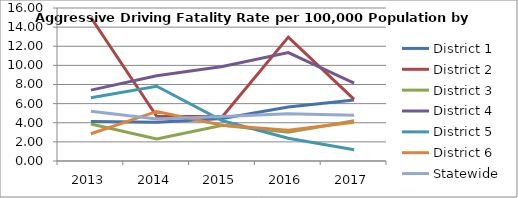
| Category | District 1 | District 2 | District 3 | District 4 | District 5 | District 6 | Statewide |
|---|---|---|---|---|---|---|---|
| 2013.0 | 4.137 | 15.011 | 3.876 | 7.413 | 6.621 | 2.85 | 5.21 |
| 2014.0 | 4.065 | 4.671 | 2.306 | 8.924 | 7.82 | 5.183 | 4.405 |
| 2015.0 | 4.444 | 4.656 | 3.735 | 9.876 | 4.206 | 3.736 | 4.653 |
| 2016.0 | 5.65 | 12.954 | 3.006 | 11.343 | 2.384 | 3.208 | 4.931 |
| 2017.0 | 6.387 | 6.45 | 4.204 | 8.134 | 1.178 | 4.051 | 4.776 |